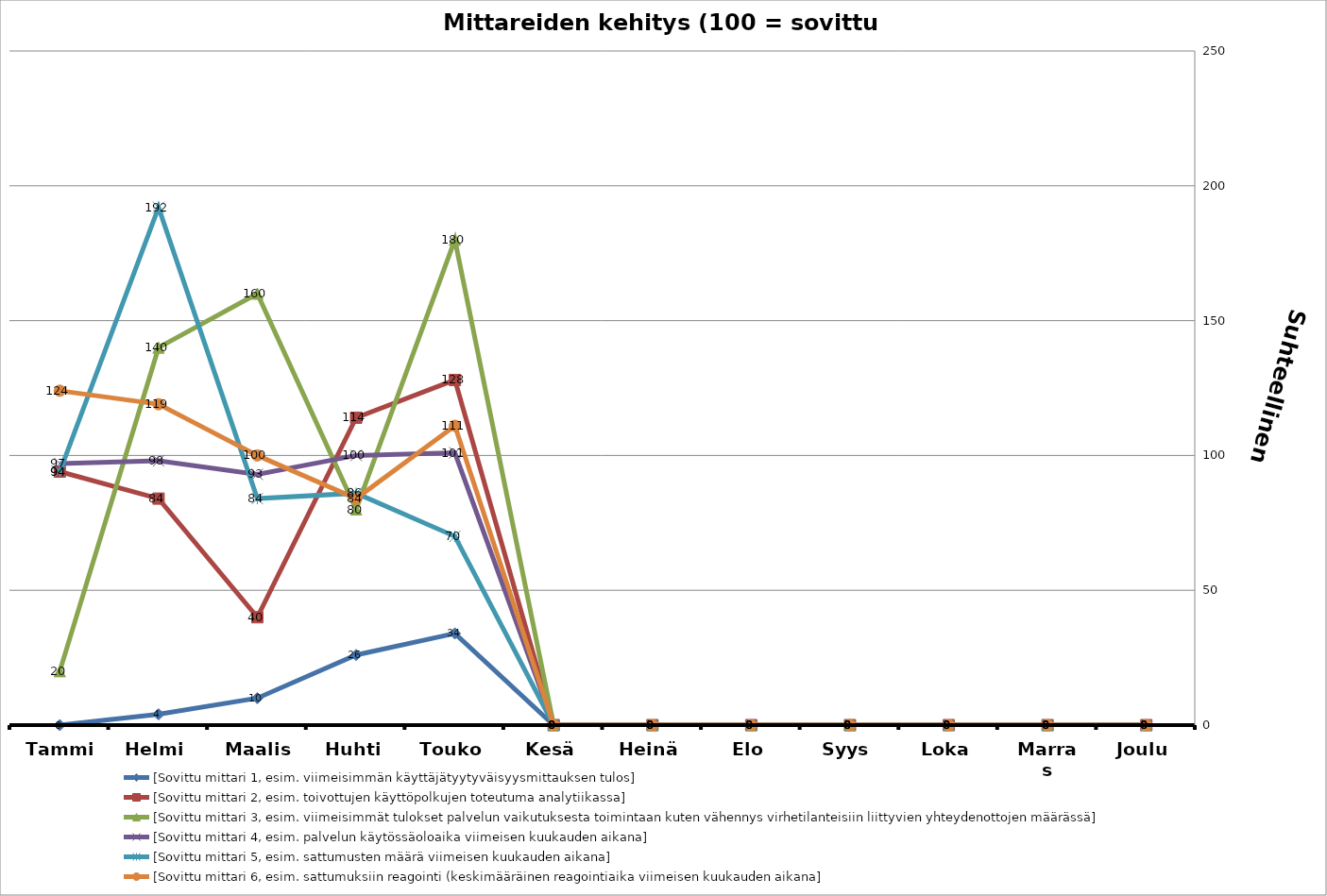
| Category | [Sovittu mittari 1, esim. viimeisimmän käyttäjätyytyväisyysmittauksen tulos] | [Sovittu mittari 2, esim. toivottujen käyttöpolkujen toteutuma analytiikassa] | [Sovittu mittari 3, esim. viimeisimmät tulokset palvelun vaikutuksesta toimintaan kuten vähennys virhetilanteisiin liittyvien yhteydenottojen määrässä] | [Sovittu mittari 4, esim. palvelun käytössäoloaika viimeisen kuukauden aikana] | [Sovittu mittari 5, esim. sattumusten määrä viimeisen kuukauden aikana] | [Sovittu mittari 6, esim. sattumuksiin reagointi (keskimääräinen reagointiaika viimeisen kuukauden aikana] |
|---|---|---|---|---|---|---|
| Tammi | 0 | 94 | 20 | 97 | 94 | 124 |
| Helmi | 4 | 84 | 140 | 98 | 192 | 119 |
| Maalis | 10 | 40 | 160 | 93 | 84 | 100 |
| Huhti | 26 | 114 | 80 | 100 | 86 | 84 |
| Touko | 34 | 128 | 180 | 101 | 70 | 111 |
| Kesä | 0 | 0 | 0 | 0 | 0 | 0 |
| Heinä | 0 | 0 | 0 | 0 | 0 | 0 |
| Elo | 0 | 0 | 0 | 0 | 0 | 0 |
| Syys | 0 | 0 | 0 | 0 | 0 | 0 |
| Loka | 0 | 0 | 0 | 0 | 0 | 0 |
| Marras | 0 | 0 | 0 | 0 | 0 | 0 |
| Joulu | 0 | 0 | 0 | 0 | 0 | 0 |